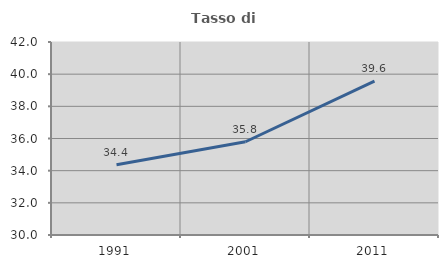
| Category | Tasso di occupazione   |
|---|---|
| 1991.0 | 34.371 |
| 2001.0 | 35.799 |
| 2011.0 | 39.564 |